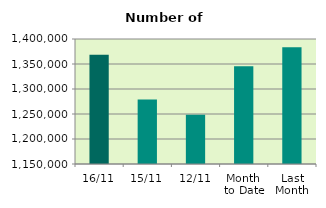
| Category | Series 0 |
|---|---|
| 16/11 | 1368314 |
| 15/11 | 1278912 |
| 12/11 | 1248346 |
| Month 
to Date | 1345533.167 |
| Last
Month | 1383348.571 |